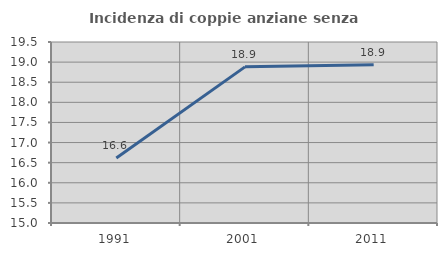
| Category | Incidenza di coppie anziane senza figli  |
|---|---|
| 1991.0 | 16.616 |
| 2001.0 | 18.882 |
| 2011.0 | 18.937 |